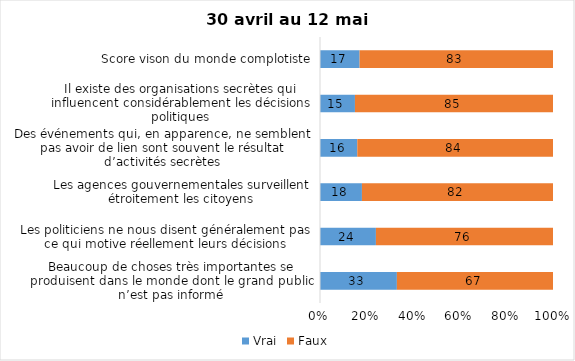
| Category | Vrai | Faux |
|---|---|---|
| Beaucoup de choses très importantes se produisent dans le monde dont le grand public n’est pas informé | 33 | 67 |
| Les politiciens ne nous disent généralement pas ce qui motive réellement leurs décisions | 24 | 76 |
| Les agences gouvernementales surveillent étroitement les citoyens | 18 | 82 |
| Des événements qui, en apparence, ne semblent pas avoir de lien sont souvent le résultat d’activités secrètes | 16 | 84 |
| Il existe des organisations secrètes qui influencent considérablement les décisions politiques | 15 | 85 |
| Score vison du monde complotiste | 17 | 83 |